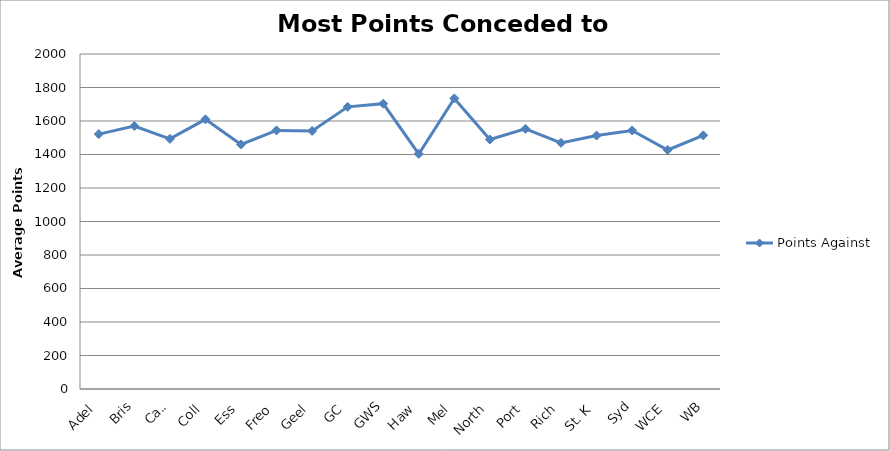
| Category | Points Against |
|---|---|
| Adel | 1521.75 |
| Bris | 1569.875 |
| Carl | 1493.25 |
| Coll | 1609.875 |
| Ess | 1460 |
| Freo | 1544 |
| Geel | 1540.625 |
| GC | 1684.5 |
| GWS | 1703.375 |
| Haw | 1403.25 |
| Mel | 1734.875 |
| North | 1489.5 |
| Port | 1553.125 |
| Rich | 1469.5 |
| St. K | 1513.125 |
| Syd | 1543.625 |
| WCE | 1426.875 |
| WB | 1514.375 |